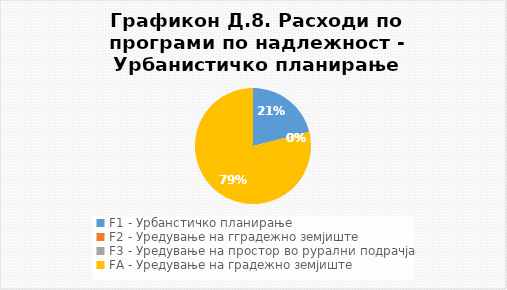
| Category | Структура |
|---|---|
| F1 - Урбанстичко планирање | 21.053 |
| F2 - Уредување на гградежно земјиште | 0 |
| F3 - Уредување на простор во рурални подрачја | 0 |
| FА - Уредување на градежно земјиште | 78.947 |